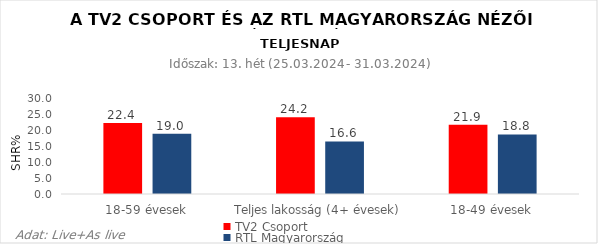
| Category | TV2 Csoport | RTL Magyarország |
|---|---|---|
| 18-59 évesek | 22.4 | 19 |
| Teljes lakosság (4+ évesek) | 24.2 | 16.6 |
| 18-49 évesek | 21.9 | 18.8 |